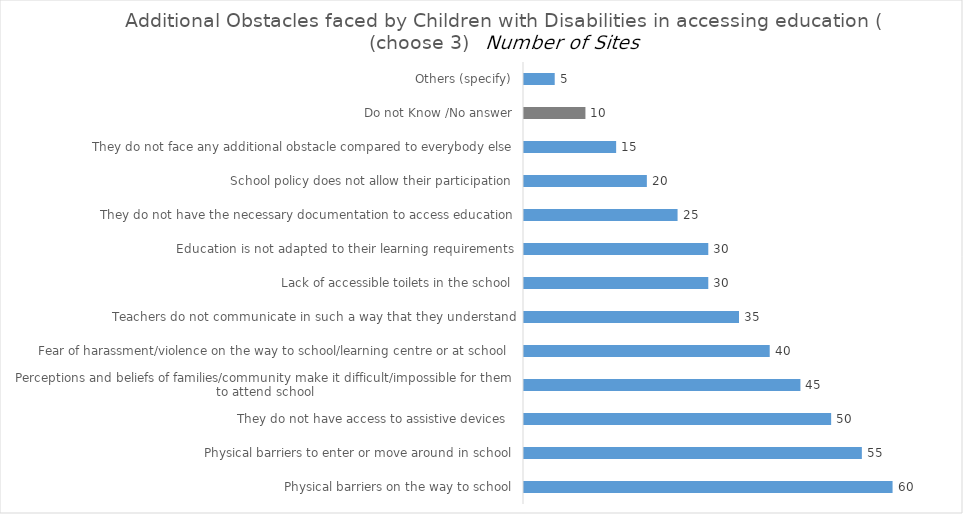
| Category | Additional Obstacles faced by Children with Disabilities in accessing education |
|---|---|
| Physical barriers on the way to school | 60 |
| Physical barriers to enter or move around in school | 55 |
| They do not have access to assistive devices  | 50 |
| Perceptions and beliefs of families/community make it difficult/impossible for them to attend school | 45 |
| Fear of harassment/violence on the way to school/learning centre or at school  | 40 |
| Teachers do not communicate in such a way that they understand | 35 |
| Lack of accessible toilets in the school | 30 |
| Education is not adapted to their learning requirements | 30 |
| They do not have the necessary documentation to access education | 25 |
| School policy does not allow their participation | 20 |
| They do not face any additional obstacle compared to everybody else | 15 |
| Do not Know /No answer | 10 |
| Others (specify) | 5 |